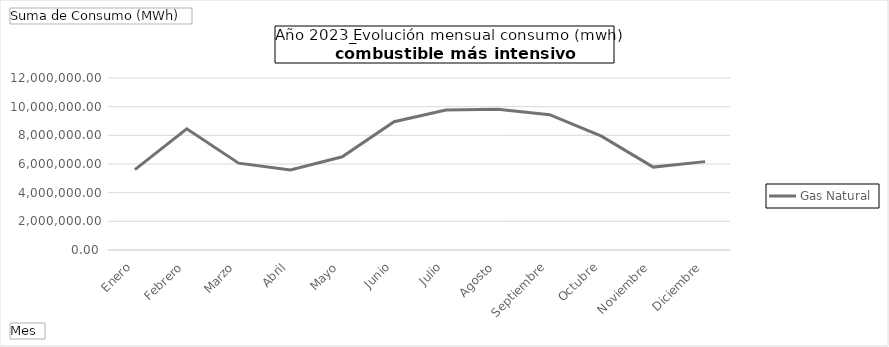
| Category | Gas Natural |
|---|---|
| Enero | 5607946.49 |
| Febrero | 8455310.19 |
| Marzo | 6058023.65 |
| Abril | 5582503.06 |
| Mayo | 6502307.36 |
| Junio | 8946634.24 |
| Julio | 9763918.67 |
| Agosto | 9814519.28 |
| Septiembre | 9438922.06 |
| Octubre | 7939457.93 |
| Noviembre | 5783093.72 |
| Diciembre | 6165756.761 |